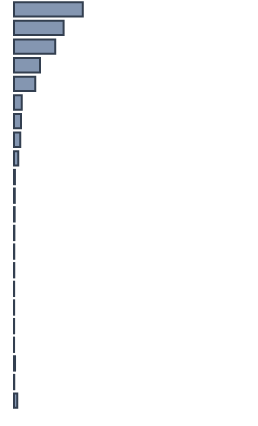
| Category | Percentatge |
|---|---|
| 0 | 28.663 |
| 1 | 20.669 |
| 2 | 17.177 |
| 3 | 10.79 |
| 4 | 8.825 |
| 5 | 3.202 |
| 6 | 2.901 |
| 7 | 2.614 |
| 8 | 1.732 |
| 9 | 0.386 |
| 10 | 0.328 |
| 11 | 0.27 |
| 12 | 0.16 |
| 13 | 0.105 |
| 14 | 0.104 |
| 15 | 0.055 |
| 16 | 0.05 |
| 17 | 0.04 |
| 18 | 0.024 |
| 19 | 0.431 |
| 20 | 0.101 |
| 21 | 1.373 |